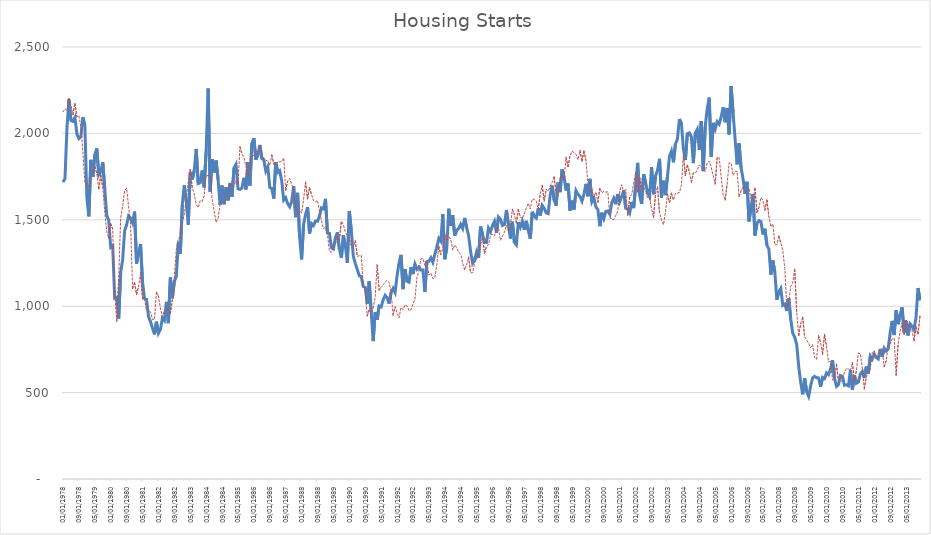
| Category | Series 0 | Series 1 |
|---|---|---|
| 01/01/1978 | 1718 | 2124.971 |
| 02/01/1978 | 1738 | 2141.772 |
| 03/01/1978 | 2032 | 2132.859 |
| 04/01/1978 | 2197 | 2201.332 |
| 05/01/1978 | 2075 | 2159.435 |
| 06/01/1978 | 2070 | 2109.277 |
| 07/01/1978 | 2092 | 2172.914 |
| 08/01/1978 | 1996 | 2096.96 |
| 09/01/1978 | 1970 | 2102.787 |
| 10/01/1978 | 1981 | 2037.375 |
| 11/01/1978 | 2094 | 1892.223 |
| 12/01/1978 | 2044 | 1716.559 |
| 01/01/1979 | 1630 | 1697.857 |
| 02/01/1979 | 1520 | 1693.108 |
| 03/01/1979 | 1847 | 1739.85 |
| 04/01/1979 | 1748 | 1746.766 |
| 05/01/1979 | 1876 | 1807.352 |
| 06/01/1979 | 1913 | 1769.211 |
| 07/01/1979 | 1760 | 1679.19 |
| 08/01/1979 | 1778 | 1758.919 |
| 09/01/1979 | 1832 | 1686.042 |
| 10/01/1979 | 1681 | 1543.512 |
| 11/01/1979 | 1524 | 1433.898 |
| 12/01/1979 | 1498 | 1393.962 |
| 01/01/1980 | 1341 | 1477.961 |
| 02/01/1980 | 1350 | 1446.127 |
| 03/01/1980 | 1047 | 1083.027 |
| 04/01/1980 | 1051 | 913.457 |
| 05/01/1980 | 927 | 1154.815 |
| 06/01/1980 | 1196 | 1514.135 |
| 07/01/1980 | 1269 | 1576.566 |
| 08/01/1980 | 1436 | 1668.888 |
| 09/01/1980 | 1471 | 1682.526 |
| 10/01/1980 | 1523 | 1575.766 |
| 11/01/1980 | 1510 | 1471.292 |
| 12/01/1980 | 1482 | 1101.69 |
| 01/01/1981 | 1547 | 1136.02 |
| 02/01/1981 | 1246 | 1067.611 |
| 03/01/1981 | 1306 | 1113.22 |
| 04/01/1981 | 1360 | 1191.807 |
| 05/01/1981 | 1140 | 1040.717 |
| 06/01/1981 | 1045 | 1040.051 |
| 07/01/1981 | 1041 | 975.914 |
| 08/01/1981 | 940 | 982.328 |
| 09/01/1981 | 911 | 965.613 |
| 10/01/1981 | 873 | 923.575 |
| 11/01/1981 | 837 | 921.575 |
| 12/01/1981 | 910 | 1081.159 |
| 01/01/1982 | 843 | 1056.416 |
| 02/01/1982 | 866 | 988.963 |
| 03/01/1982 | 931 | 939.312 |
| 04/01/1982 | 917 | 975.426 |
| 05/01/1982 | 1025 | 980.663 |
| 06/01/1982 | 902 | 992.414 |
| 07/01/1982 | 1166 | 957.024 |
| 08/01/1982 | 1046 | 1037.055 |
| 09/01/1982 | 1144 | 1170.725 |
| 10/01/1982 | 1173 | 1330.397 |
| 11/01/1982 | 1372 | 1389.569 |
| 12/01/1982 | 1303 | 1404.745 |
| 01/01/1983 | 1586 | 1489.419 |
| 02/01/1983 | 1699 | 1531.277 |
| 03/01/1983 | 1606 | 1625.786 |
| 04/01/1983 | 1472 | 1718.058 |
| 05/01/1983 | 1776 | 1791.083 |
| 06/01/1983 | 1733 | 1687.72 |
| 07/01/1983 | 1785 | 1649.647 |
| 08/01/1983 | 1910 | 1587.904 |
| 09/01/1983 | 1710 | 1571.606 |
| 10/01/1983 | 1715 | 1610.357 |
| 11/01/1983 | 1785 | 1606.866 |
| 12/01/1983 | 1688 | 1640.697 |
| 01/01/1984 | 1897 | 1760.195 |
| 02/01/1984 | 2260 | 1753.577 |
| 03/01/1984 | 1663 | 1758.239 |
| 04/01/1984 | 1851 | 1619.249 |
| 05/01/1984 | 1774 | 1552.734 |
| 06/01/1984 | 1843 | 1484.456 |
| 07/01/1984 | 1732 | 1507.622 |
| 08/01/1984 | 1586 | 1593.824 |
| 09/01/1984 | 1698 | 1610.562 |
| 10/01/1984 | 1590 | 1596.606 |
| 11/01/1984 | 1689 | 1638.381 |
| 12/01/1984 | 1612 | 1645.249 |
| 01/01/1985 | 1711 | 1715.408 |
| 02/01/1985 | 1632 | 1692.377 |
| 03/01/1985 | 1800 | 1699.355 |
| 04/01/1985 | 1821 | 1727.899 |
| 05/01/1985 | 1680 | 1707.443 |
| 06/01/1985 | 1676 | 1921.557 |
| 07/01/1985 | 1684 | 1883.352 |
| 08/01/1985 | 1743 | 1858.504 |
| 09/01/1985 | 1676 | 1810.89 |
| 10/01/1985 | 1834 | 1753.472 |
| 11/01/1985 | 1698 | 1815.723 |
| 12/01/1985 | 1942 | 1867.657 |
| 01/01/1986 | 1972 | 1872.561 |
| 02/01/1986 | 1848 | 1898.678 |
| 03/01/1986 | 1876 | 1889.911 |
| 04/01/1986 | 1933 | 1926.073 |
| 05/01/1986 | 1854 | 1882.443 |
| 06/01/1986 | 1847 | 1856.984 |
| 07/01/1986 | 1782 | 1845.102 |
| 08/01/1986 | 1807 | 1839.118 |
| 09/01/1986 | 1687 | 1814.56 |
| 10/01/1986 | 1681 | 1873.82 |
| 11/01/1986 | 1623 | 1821.609 |
| 12/01/1986 | 1833 | 1820.366 |
| 01/01/1987 | 1774 | 1836.557 |
| 02/01/1987 | 1784 | 1834.914 |
| 03/01/1987 | 1726 | 1837.008 |
| 04/01/1987 | 1614 | 1857.795 |
| 05/01/1987 | 1628 | 1670.504 |
| 06/01/1987 | 1594 | 1724.704 |
| 07/01/1987 | 1575 | 1739.712 |
| 08/01/1987 | 1605 | 1704.327 |
| 09/01/1987 | 1695 | 1675.681 |
| 10/01/1987 | 1515 | 1572.153 |
| 11/01/1987 | 1656 | 1525.827 |
| 12/01/1987 | 1400 | 1561.596 |
| 01/01/1988 | 1271 | 1538.182 |
| 02/01/1988 | 1473 | 1619.227 |
| 03/01/1988 | 1532 | 1717.548 |
| 04/01/1988 | 1573 | 1621.505 |
| 05/01/1988 | 1421 | 1685.872 |
| 06/01/1988 | 1478 | 1646.54 |
| 07/01/1988 | 1467 | 1609.652 |
| 08/01/1988 | 1493 | 1602.538 |
| 09/01/1988 | 1492 | 1613.26 |
| 10/01/1988 | 1522 | 1548.689 |
| 11/01/1988 | 1569 | 1494.813 |
| 12/01/1988 | 1563 | 1447.844 |
| 01/01/1989 | 1621 | 1457.587 |
| 02/01/1989 | 1425 | 1415.823 |
| 03/01/1989 | 1422 | 1316.842 |
| 04/01/1989 | 1339 | 1312.066 |
| 05/01/1989 | 1331 | 1350.6 |
| 06/01/1989 | 1397 | 1354.818 |
| 07/01/1989 | 1427 | 1408.828 |
| 08/01/1989 | 1332 | 1382.001 |
| 09/01/1989 | 1279 | 1491.898 |
| 10/01/1989 | 1410 | 1472.301 |
| 11/01/1989 | 1351 | 1427.223 |
| 12/01/1989 | 1251 | 1405.835 |
| 01/01/1990 | 1551 | 1397.68 |
| 02/01/1990 | 1437 | 1346.583 |
| 03/01/1990 | 1289 | 1341.952 |
| 04/01/1990 | 1248 | 1378.712 |
| 05/01/1990 | 1212 | 1288.028 |
| 06/01/1990 | 1177 | 1292.666 |
| 07/01/1990 | 1171 | 1293.304 |
| 08/01/1990 | 1115 | 1122.769 |
| 09/01/1990 | 1110 | 1090.522 |
| 10/01/1990 | 1014 | 944.052 |
| 11/01/1990 | 1145 | 980.302 |
| 12/01/1990 | 969 | 959.454 |
| 01/01/1991 | 798 | 989.286 |
| 02/01/1991 | 965 | 1054.298 |
| 03/01/1991 | 921 | 1239.721 |
| 04/01/1991 | 1001 | 1092.292 |
| 05/01/1991 | 996 | 1108.611 |
| 06/01/1991 | 1036 | 1124.222 |
| 07/01/1991 | 1063 | 1138.29 |
| 08/01/1991 | 1049 | 1149.559 |
| 09/01/1991 | 1015 | 1137.462 |
| 10/01/1991 | 1079 | 1085.925 |
| 11/01/1991 | 1103 | 948.96 |
| 12/01/1991 | 1079 | 996.894 |
| 01/01/1992 | 1176 | 960.567 |
| 02/01/1992 | 1250 | 932.936 |
| 03/01/1992 | 1297 | 993.216 |
| 04/01/1992 | 1099 | 979.911 |
| 05/01/1992 | 1214 | 1007.732 |
| 06/01/1992 | 1145 | 1001.462 |
| 07/01/1992 | 1139 | 975.351 |
| 08/01/1992 | 1226 | 978.998 |
| 09/01/1992 | 1186 | 1012.378 |
| 10/01/1992 | 1244 | 1039.857 |
| 11/01/1992 | 1214 | 1167.972 |
| 12/01/1992 | 1227 | 1201.383 |
| 01/01/1993 | 1210 | 1273.609 |
| 02/01/1993 | 1210 | 1275.36 |
| 03/01/1993 | 1083 | 1236.097 |
| 04/01/1993 | 1258 | 1260.728 |
| 05/01/1993 | 1260 | 1179.489 |
| 06/01/1993 | 1280 | 1191.3 |
| 07/01/1993 | 1254 | 1159.697 |
| 08/01/1993 | 1300 | 1163.499 |
| 09/01/1993 | 1343 | 1241.393 |
| 10/01/1993 | 1392 | 1346.939 |
| 11/01/1993 | 1376 | 1298.303 |
| 12/01/1993 | 1533 | 1335.033 |
| 01/01/1994 | 1272 | 1412.081 |
| 02/01/1994 | 1337 | 1377.609 |
| 03/01/1994 | 1564 | 1403.857 |
| 04/01/1994 | 1465 | 1387.283 |
| 05/01/1994 | 1526 | 1324.452 |
| 06/01/1994 | 1409 | 1353.751 |
| 07/01/1994 | 1439 | 1337.956 |
| 08/01/1994 | 1450 | 1313.58 |
| 09/01/1994 | 1474 | 1301.006 |
| 10/01/1994 | 1450 | 1249.558 |
| 11/01/1994 | 1511 | 1209.42 |
| 12/01/1994 | 1455 | 1238.236 |
| 01/01/1995 | 1407 | 1283.722 |
| 02/01/1995 | 1316 | 1193.052 |
| 03/01/1995 | 1249 | 1194.6 |
| 04/01/1995 | 1267 | 1251.32 |
| 05/01/1995 | 1314 | 1265.774 |
| 06/01/1995 | 1281 | 1343.884 |
| 07/01/1995 | 1461 | 1354.244 |
| 08/01/1995 | 1416 | 1397.221 |
| 09/01/1995 | 1369 | 1306.77 |
| 10/01/1995 | 1369 | 1346.541 |
| 11/01/1995 | 1452 | 1354.044 |
| 12/01/1995 | 1431 | 1412.587 |
| 01/01/1996 | 1467 | 1415.637 |
| 02/01/1996 | 1491 | 1408.651 |
| 03/01/1996 | 1424 | 1454.581 |
| 04/01/1996 | 1516 | 1456.664 |
| 05/01/1996 | 1504 | 1380.747 |
| 06/01/1996 | 1467 | 1405.392 |
| 07/01/1996 | 1472 | 1427.479 |
| 08/01/1996 | 1557 | 1468.253 |
| 09/01/1996 | 1475 | 1434.502 |
| 10/01/1996 | 1392 | 1471.073 |
| 11/01/1996 | 1489 | 1560.883 |
| 12/01/1996 | 1370 | 1529.815 |
| 01/01/1997 | 1355 | 1481.071 |
| 02/01/1997 | 1486 | 1559.737 |
| 03/01/1997 | 1457 | 1514.65 |
| 04/01/1997 | 1492 | 1506.377 |
| 05/01/1997 | 1442 | 1533.48 |
| 06/01/1997 | 1494 | 1568.094 |
| 07/01/1997 | 1437 | 1595.686 |
| 08/01/1997 | 1390 | 1562.483 |
| 09/01/1997 | 1546 | 1619.664 |
| 10/01/1997 | 1520 | 1618.15 |
| 11/01/1997 | 1510 | 1607.935 |
| 12/01/1997 | 1566 | 1560.058 |
| 01/01/1998 | 1525 | 1649.81 |
| 02/01/1998 | 1584 | 1699.009 |
| 03/01/1998 | 1567 | 1608.034 |
| 04/01/1998 | 1540 | 1676.882 |
| 05/01/1998 | 1536 | 1665.308 |
| 06/01/1998 | 1641 | 1692.306 |
| 07/01/1998 | 1698 | 1717.096 |
| 08/01/1998 | 1614 | 1747.971 |
| 09/01/1998 | 1582 | 1651.744 |
| 10/01/1998 | 1715 | 1652.421 |
| 11/01/1998 | 1660 | 1736.357 |
| 12/01/1998 | 1792 | 1760.891 |
| 01/01/1999 | 1748 | 1738.221 |
| 02/01/1999 | 1670 | 1861.74 |
| 03/01/1999 | 1710 | 1808.971 |
| 04/01/1999 | 1553 | 1871.685 |
| 05/01/1999 | 1611 | 1895.817 |
| 06/01/1999 | 1559 | 1889.889 |
| 07/01/1999 | 1669 | 1878.857 |
| 08/01/1999 | 1648 | 1847.565 |
| 09/01/1999 | 1635 | 1900.991 |
| 10/01/1999 | 1608 | 1839.723 |
| 11/01/1999 | 1648 | 1897.796 |
| 12/01/1999 | 1708 | 1843.474 |
| 01/01/2000 | 1636 | 1709.773 |
| 02/01/2000 | 1737 | 1660.196 |
| 03/01/2000 | 1604 | 1675.57 |
| 04/01/2000 | 1626 | 1629.862 |
| 05/01/2000 | 1575 | 1660.393 |
| 06/01/2000 | 1559 | 1602.056 |
| 07/01/2000 | 1463 | 1683.798 |
| 08/01/2000 | 1541 | 1655.494 |
| 09/01/2000 | 1507 | 1665.098 |
| 10/01/2000 | 1549 | 1659.053 |
| 11/01/2000 | 1551 | 1662.693 |
| 12/01/2000 | 1532 | 1516.85 |
| 01/01/2001 | 1600 | 1502.051 |
| 02/01/2001 | 1625 | 1500.995 |
| 03/01/2001 | 1590 | 1526.501 |
| 04/01/2001 | 1649 | 1551.049 |
| 05/01/2001 | 1605 | 1666.193 |
| 06/01/2001 | 1636 | 1703.5 |
| 07/01/2001 | 1670 | 1658.374 |
| 08/01/2001 | 1567 | 1677.397 |
| 09/01/2001 | 1562 | 1525.902 |
| 10/01/2001 | 1540 | 1630.006 |
| 11/01/2001 | 1602 | 1647.011 |
| 12/01/2001 | 1568 | 1712.146 |
| 01/01/2002 | 1698 | 1772.465 |
| 02/01/2002 | 1829 | 1661.299 |
| 03/01/2002 | 1642 | 1745.359 |
| 04/01/2002 | 1592 | 1674.249 |
| 05/01/2002 | 1764 | 1685.965 |
| 06/01/2002 | 1717 | 1665.018 |
| 07/01/2002 | 1655 | 1626.326 |
| 08/01/2002 | 1633 | 1624.425 |
| 09/01/2002 | 1804 | 1564.855 |
| 10/01/2002 | 1648 | 1513.123 |
| 11/01/2002 | 1753 | 1653.078 |
| 12/01/2002 | 1788 | 1690 |
| 01/01/2003 | 1853 | 1542.354 |
| 02/01/2003 | 1629 | 1498.375 |
| 03/01/2003 | 1726 | 1471.283 |
| 04/01/2003 | 1643 | 1546.811 |
| 05/01/2003 | 1751 | 1647.78 |
| 06/01/2003 | 1867 | 1600.024 |
| 07/01/2003 | 1897 | 1653.664 |
| 08/01/2003 | 1833 | 1614.879 |
| 09/01/2003 | 1939 | 1653.688 |
| 10/01/2003 | 1967 | 1654.051 |
| 11/01/2003 | 2083 | 1658.155 |
| 12/01/2003 | 2057 | 1699.783 |
| 01/01/2004 | 1911 | 1873.67 |
| 02/01/2004 | 1846 | 1755.955 |
| 03/01/2004 | 1998 | 1816.27 |
| 04/01/2004 | 2003 | 1779.415 |
| 05/01/2004 | 1981 | 1718.255 |
| 06/01/2004 | 1828 | 1771.135 |
| 07/01/2004 | 2002 | 1769.751 |
| 08/01/2004 | 2024 | 1788.016 |
| 09/01/2004 | 1905 | 1817.396 |
| 10/01/2004 | 2072 | 1800.734 |
| 11/01/2004 | 1782 | 1792.667 |
| 12/01/2004 | 2042 | 1778.726 |
| 01/01/2005 | 2144 | 1831.122 |
| 02/01/2005 | 2207 | 1838.399 |
| 03/01/2005 | 1864 | 1805.342 |
| 04/01/2005 | 2061 | 1751.915 |
| 05/01/2005 | 2025 | 1707.827 |
| 06/01/2005 | 2068 | 1860.143 |
| 07/01/2005 | 2054 | 1859.709 |
| 08/01/2005 | 2095 | 1749.423 |
| 09/01/2005 | 2151 | 1645.319 |
| 10/01/2005 | 2065 | 1614.728 |
| 11/01/2005 | 2147 | 1707.045 |
| 12/01/2005 | 1994 | 1829.637 |
| 01/01/2006 | 2273 | 1826.841 |
| 02/01/2006 | 2119 | 1757.008 |
| 03/01/2006 | 1969 | 1777.44 |
| 04/01/2006 | 1821 | 1782.235 |
| 05/01/2006 | 1942 | 1634.627 |
| 06/01/2006 | 1802 | 1667.893 |
| 07/01/2006 | 1737 | 1689.895 |
| 08/01/2006 | 1650 | 1654.771 |
| 09/01/2006 | 1720 | 1670.839 |
| 10/01/2006 | 1491 | 1682.273 |
| 11/01/2006 | 1570 | 1622.408 |
| 12/01/2006 | 1649 | 1605.669 |
| 01/01/2007 | 1409 | 1682.77 |
| 02/01/2007 | 1480 | 1543.713 |
| 03/01/2007 | 1495 | 1570.029 |
| 04/01/2007 | 1490 | 1628.804 |
| 05/01/2007 | 1415 | 1613.831 |
| 06/01/2007 | 1448 | 1556.482 |
| 07/01/2007 | 1354 | 1614.172 |
| 08/01/2007 | 1330 | 1519.592 |
| 09/01/2007 | 1183 | 1459.431 |
| 10/01/2007 | 1264 | 1476.009 |
| 11/01/2007 | 1197 | 1356.198 |
| 12/01/2007 | 1037 | 1354.927 |
| 01/01/2008 | 1084 | 1405.971 |
| 02/01/2008 | 1103 | 1365.836 |
| 03/01/2008 | 1005 | 1322.221 |
| 04/01/2008 | 1013 | 1218.058 |
| 05/01/2008 | 973 | 998.526 |
| 06/01/2008 | 1046 | 1023.696 |
| 07/01/2008 | 923 | 1114.606 |
| 08/01/2008 | 844 | 1133.377 |
| 09/01/2008 | 820 | 1213.532 |
| 10/01/2008 | 777 | 962.738 |
| 11/01/2008 | 652 | 829.696 |
| 12/01/2008 | 560 | 900.071 |
| 01/01/2009 | 490 | 936.396 |
| 02/01/2009 | 582 | 822.969 |
| 03/01/2009 | 505 | 804.034 |
| 04/01/2009 | 478 | 785.639 |
| 05/01/2009 | 540 | 759.84 |
| 06/01/2009 | 585 | 778.402 |
| 07/01/2009 | 594 | 702.504 |
| 08/01/2009 | 586 | 692.496 |
| 09/01/2009 | 585 | 829.1 |
| 10/01/2009 | 534 | 788.621 |
| 11/01/2009 | 588 | 722.377 |
| 12/01/2009 | 581 | 837.247 |
| 01/01/2010 | 614 | 766.248 |
| 02/01/2010 | 604 | 676.678 |
| 03/01/2010 | 636 | 680.843 |
| 04/01/2010 | 687 | 572.002 |
| 05/01/2010 | 583 | 594.545 |
| 06/01/2010 | 536 | 664.352 |
| 07/01/2010 | 546 | 565.64 |
| 08/01/2010 | 599 | 564.291 |
| 09/01/2010 | 594 | 568.353 |
| 10/01/2010 | 543 | 618.271 |
| 11/01/2010 | 545 | 639.465 |
| 12/01/2010 | 539 | 638.022 |
| 01/01/2011 | 630 | 625.885 |
| 02/01/2011 | 517 | 673.089 |
| 03/01/2011 | 600 | 565.206 |
| 04/01/2011 | 554 | 626.663 |
| 05/01/2011 | 561 | 729.532 |
| 06/01/2011 | 608 | 724.453 |
| 07/01/2011 | 623 | 639.961 |
| 08/01/2011 | 585 | 521.597 |
| 09/01/2011 | 650 | 593.214 |
| 10/01/2011 | 610 | 609.832 |
| 11/01/2011 | 711 | 636.96 |
| 12/01/2011 | 694 | 732.551 |
| 01/01/2012 | 723 | 742.971 |
| 02/01/2012 | 704 | 697.632 |
| 03/01/2012 | 695 | 712.73 |
| 04/01/2012 | 753 | 751.488 |
| 05/01/2012 | 708 | 739.904 |
| 06/01/2012 | 757 | 649.897 |
| 07/01/2012 | 740 | 684.068 |
| 08/01/2012 | 754 | 772.027 |
| 09/01/2012 | 847 | 780.315 |
| 10/01/2012 | 915 | 810.901 |
| 11/01/2012 | 833 | 814.964 |
| 12/01/2012 | 976 | 600.904 |
| 01/01/2013 | 896 | 778.685 |
| 02/01/2013 | 951 | 855.995 |
| 03/01/2013 | 994 | 899.411 |
| 04/01/2013 | 848 | 837.014 |
| 05/01/2013 | 915 | 918.172 |
| 06/01/2013 | 831 | 887.967 |
| 07/01/2013 | 898 | 886.461 |
| 08/01/2013 | 885 | 858.149 |
| 09/01/2013 | 863 | 799.809 |
| 10/01/2013 | 936 | 878.755 |
| 11/01/2013 | 1105 | 839.094 |
| 12/01/2013 | 1034 | 944.799 |